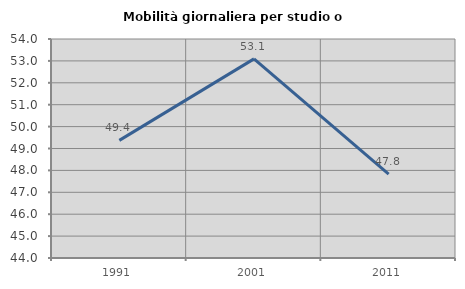
| Category | Mobilità giornaliera per studio o lavoro |
|---|---|
| 1991.0 | 49.372 |
| 2001.0 | 53.093 |
| 2011.0 | 47.826 |